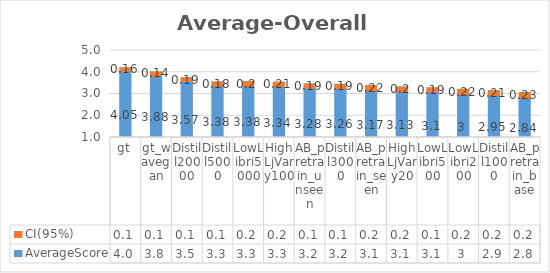
| Category | AverageScore | CI(95%) |
|---|---|---|
| 0 | 4.05 | 0.16 |
| 1 | 3.88 | 0.14 |
| 2 | 3.57 | 0.19 |
| 3 | 3.38 | 0.18 |
| 4 | 3.38 | 0.2 |
| 5 | 3.34 | 0.21 |
| 6 | 3.28 | 0.19 |
| 7 | 3.26 | 0.19 |
| 8 | 3.17 | 0.22 |
| 9 | 3.13 | 0.2 |
| 10 | 3.1 | 0.19 |
| 11 | 3 | 0.22 |
| 12 | 2.95 | 0.21 |
| 13 | 2.84 | 0.23 |